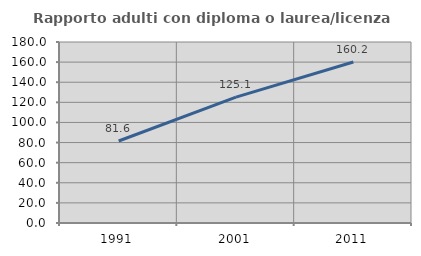
| Category | Rapporto adulti con diploma o laurea/licenza media  |
|---|---|
| 1991.0 | 81.566 |
| 2001.0 | 125.132 |
| 2011.0 | 160.151 |